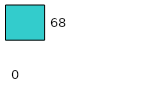
| Category | Series 0 | Series 1 |
|---|---|---|
| 0 | 0 | 68 |